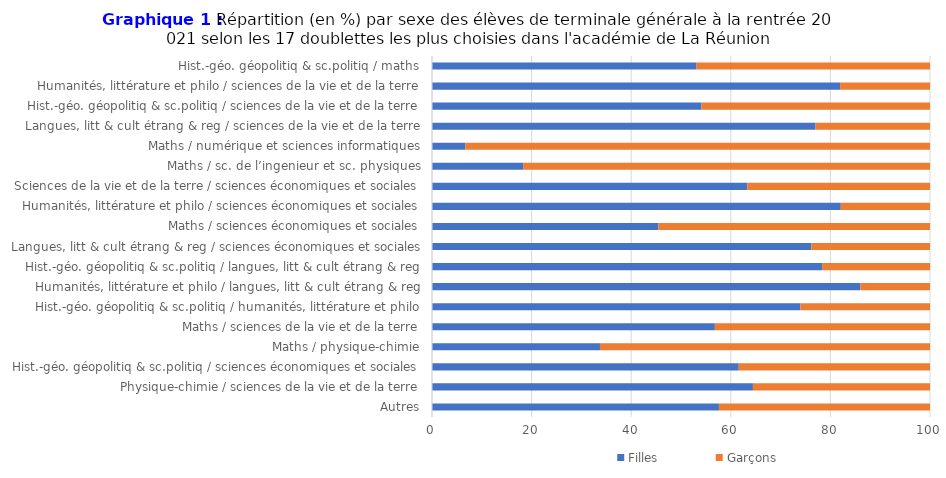
| Category | Filles | Garçons |
|---|---|---|
| Autres | 57.618 | 42.382 |
| Physique-chimie / sciences de la vie et de la terre | 64.444 | 35.556 |
| Hist.-géo. géopolitiq & sc.politiq / sciences économiques et sociales | 61.601 | 38.399 |
| Maths / physique-chimie | 33.729 | 66.271 |
| Maths / sciences de la vie et de la terre | 56.798 | 43.202 |
| Hist.-géo. géopolitiq & sc.politiq / humanités, littérature et philo | 73.984 | 26.016 |
| Humanités, littérature et philo / langues, litt & cult étrang & reg | 86.008 | 13.992 |
| Hist.-géo. géopolitiq & sc.politiq / langues, litt & cult étrang & reg | 78.333 | 21.667 |
| Langues, litt & cult étrang & reg / sciences économiques et sociales | 76.17 | 23.83 |
| Maths / sciences économiques et sociales | 45.455 | 54.545 |
| Humanités, littérature et philo / sciences économiques et sociales | 82.09 | 17.91 |
| Sciences de la vie et de la terre / sciences économiques et sociales | 63.317 | 36.683 |
| Maths / sc. de l’ingenieur et sc. physiques | 18.301 | 81.699 |
| Maths / numérique et sciences informatiques | 6.723 | 93.277 |
| Langues, litt & cult étrang & reg / sciences de la vie et de la terre | 77.011 | 22.989 |
| Hist.-géo. géopolitiq & sc.politiq / sciences de la vie et de la terre | 54.118 | 45.882 |
| Humanités, littérature et philo / sciences de la vie et de la terre | 81.944 | 18.056 |
| Hist.-géo. géopolitiq & sc.politiq / maths | 53.125 | 46.875 |